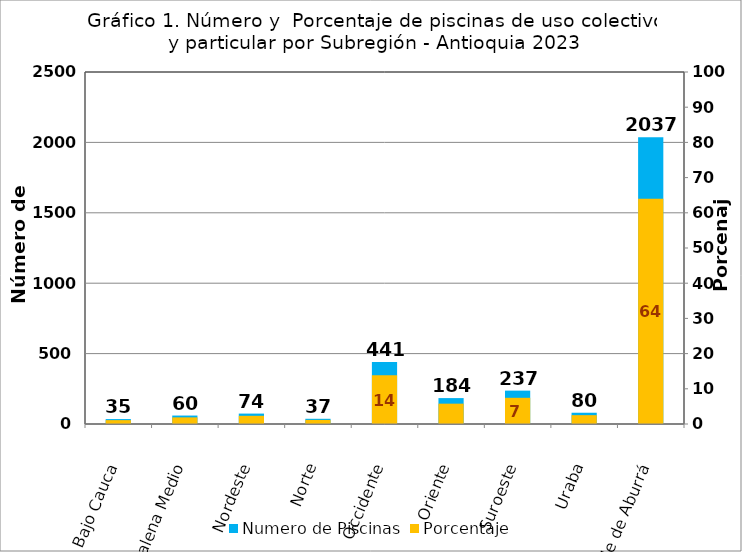
| Category | Numero de Piscinas |
|---|---|
| Bajo Cauca | 35 |
| Magdalena Medio | 60 |
| Nordeste | 74 |
| Norte | 37 |
| Occidente | 441 |
| Oriente | 184 |
| Suroeste | 237 |
| Uraba | 80 |
| Valle de Aburrá | 2037 |